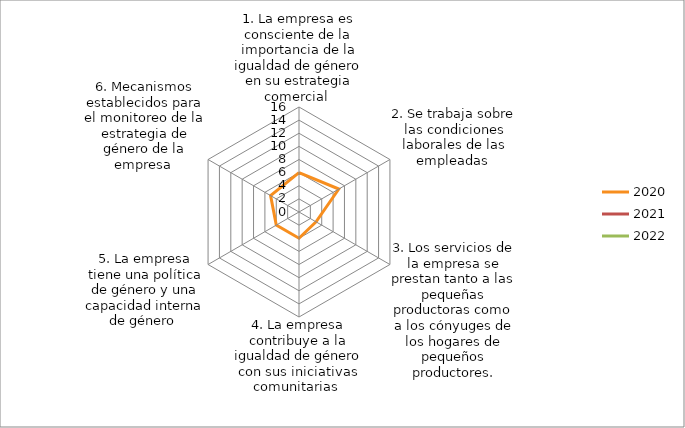
| Category | 2020 | 2021 | 2022 | 2023 |
|---|---|---|---|---|
| 1. La empresa es consciente de la importancia de la igualdad de género en su estrategia comercial  | 6 | 0 | 0 | 15 |
| 2. Se trabaja sobre las condiciones laborales de las empleadas  | 7 | 0 | 0 | 0 |
| 3. Los servicios de la empresa se prestan tanto a las pequeñas productoras como a los cónyuges de los hogares de pequeños productores. | 3 | 0 | 0 | 0 |
| 4. La empresa contribuye a la igualdad de género con sus iniciativas comunitarias  | 4 | 0 | 0 | 0 |
| 5. La empresa tiene una política de género y una capacidad interna de género  | 4 | 0 | 0 | 0 |
| 6. Mecanismos establecidos para el monitoreo de la estrategia de género de la empresa  | 5 | 0 | 0 | 0 |